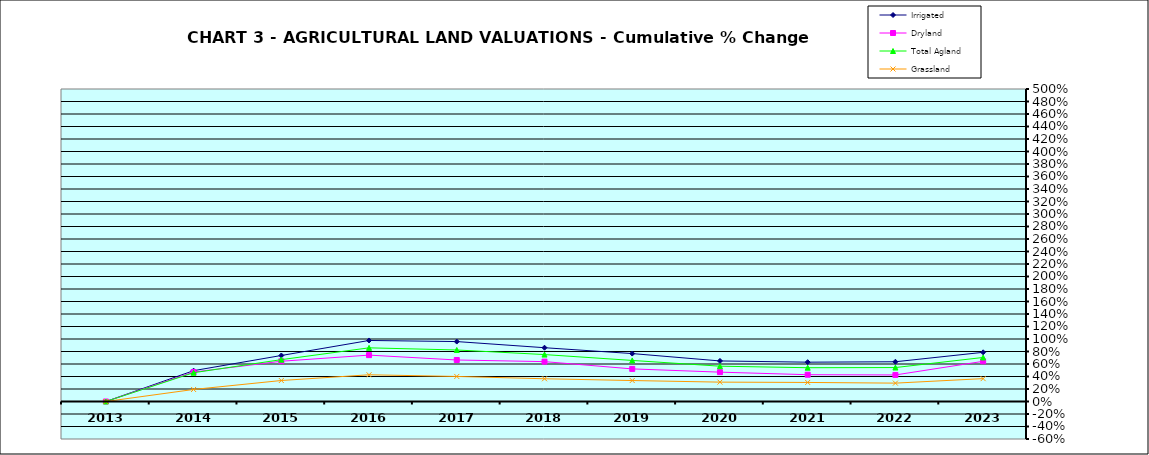
| Category | Irrigated | Dryland | Total Agland | Grassland |
|---|---|---|---|---|
| 2013.0 | 0 | 0 | 0 | 0 |
| 2014.0 | 0.493 | 0.471 | 0.46 | 0.193 |
| 2015.0 | 0.736 | 0.644 | 0.67 | 0.336 |
| 2016.0 | 0.977 | 0.742 | 0.859 | 0.428 |
| 2017.0 | 0.959 | 0.664 | 0.824 | 0.401 |
| 2018.0 | 0.861 | 0.638 | 0.751 | 0.364 |
| 2019.0 | 0.767 | 0.522 | 0.657 | 0.335 |
| 2020.0 | 0.649 | 0.47 | 0.565 | 0.31 |
| 2021.0 | 0.629 | 0.429 | 0.541 | 0.305 |
| 2022.0 | 0.636 | 0.425 | 0.543 | 0.294 |
| 2023.0 | 0.787 | 0.643 | 0.705 | 0.366 |